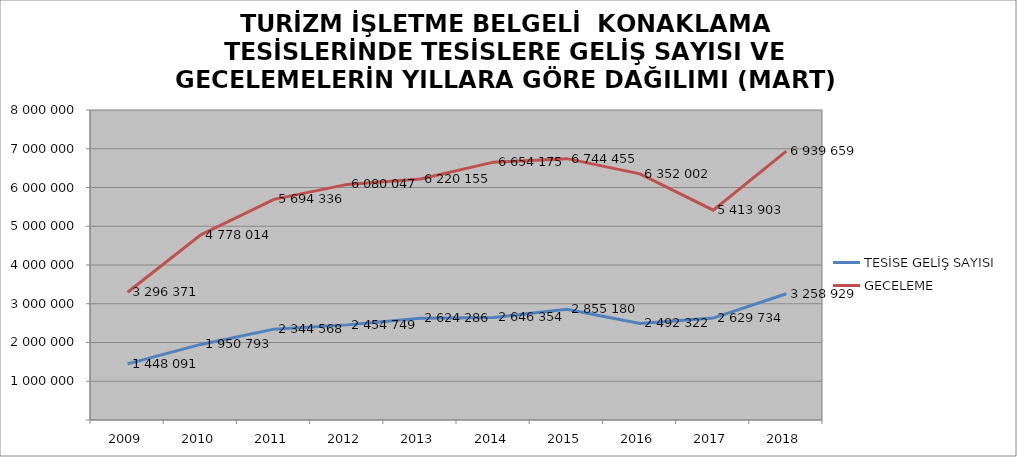
| Category | TESİSE GELİŞ SAYISI | GECELEME |
|---|---|---|
| 2009 | 1448091 | 3296371 |
| 2010 | 1950793 | 4778014 |
| 2011 | 2344568 | 5694336 |
| 2012 | 2454749 | 6080047 |
| 2013 | 2624286 | 6220155 |
| 2014 | 2646354 | 6654175 |
| 2015 | 2855180 | 6744455 |
| 2016 | 2492322 | 6352002 |
| 2017 | 2629734 | 5413903 |
| 2018 | 3258929 | 6939659 |